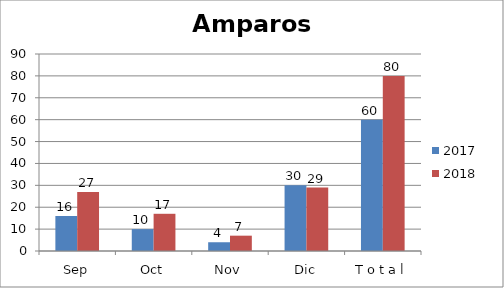
| Category | 2017 | 2018 |
|---|---|---|
| Sep | 16 | 27 |
| Oct | 10 | 17 |
| Nov | 4 | 7 |
| Dic | 30 | 29 |
| T o t a l | 60 | 80 |